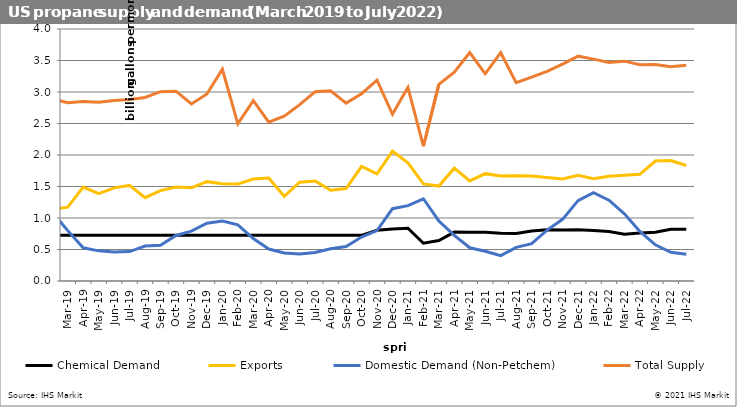
| Category | Chemical Demand | Exports | Domestic Demand (Non-Petchem)  | Total Supply  |
|---|---|---|---|---|
| 2016-01-15 | 0.757 | 1.106 | 1.058 | 2.367 |
| 2016-02-15 | 0.76 | 1.129 | 0.991 | 2.439 |
| 2016-03-15 | 0.698 | 0.859 | 0.746 | 2.413 |
| 2016-04-15 | 0.679 | 0.894 | 0.565 | 2.392 |
| 2016-05-15 | 0.643 | 1.141 | 0.5 | 2.404 |
| 2016-06-15 | 0.661 | 0.948 | 0.493 | 2.36 |
| 2016-07-15 | 0.747 | 0.964 | 0.504 | 2.379 |
| 2016-08-15 | 0.874 | 0.863 | 0.561 | 2.388 |
| 2016-09-15 | 0.827 | 0.76 | 0.615 | 2.381 |
| 2016-10-15 | 0.786 | 1.1 | 0.762 | 2.373 |
| 2016-11-15 | 0.774 | 1.084 | 0.848 | 2.466 |
| 2016-12-15 | 0.819 | 1.345 | 0.995 | 2.417 |
| 2017-01-15 | 0.819 | 1.331 | 1.06 | 2.478 |
| 2017-02-15 | 0.775 | 1.146 | 0.987 | 2.431 |
| 2017-03-15 | 0.87 | 1.289 | 0.752 | 2.484 |
| 2017-04-15 | 0.839 | 1.14 | 0.587 | 2.444 |
| 2017-05-15 | 0.807 | 1.092 | 0.504 | 2.502 |
| 2017-06-15 | 0.799 | 0.965 | 0.489 | 2.492 |
| 2017-07-15 | 0.804 | 1.015 | 0.486 | 2.497 |
| 2017-08-15 | 0.781 | 0.914 | 0.54 | 2.469 |
| 2017-09-15 | 0.705 | 1.179 | 0.603 | 2.412 |
| 2017-10-15 | 0.72 | 1.333 | 0.789 | 2.61 |
| 2017-11-15 | 0.751 | 1.196 | 0.871 | 2.632 |
| 2017-12-15 | 0.758 | 1.279 | 0.975 | 2.659 |
| 2018-01-15 | 0.759 | 1.085 | 1.198 | 2.727 |
| 2018-02-15 | 0.769 | 1.045 | 0.986 | 2.719 |
| 2018-03-15 | 0.782 | 1.135 | 0.772 | 2.69 |
| 2018-04-15 | 0.764 | 1.119 | 0.677 | 2.685 |
| 2018-05-15 | 0.708 | 1.28 | 0.512 | 2.68 |
| 2018-06-15 | 0.743 | 1.12 | 0.573 | 2.705 |
| 2018-07-15 | 0.759 | 1.372 | 0.506 | 2.756 |
| 2018-08-15 | 0.757 | 1.319 | 0.574 | 2.82 |
| 2018-09-15 | 0.748 | 1.051 | 0.629 | 2.846 |
| 2018-10-15 | 0.74 | 1.185 | 0.828 | 2.868 |
| 2018-11-15 | 0.74 | 1.326 | 0.913 | 2.962 |
| 2018-12-15 | 0.74 | 1.485 | 1.013 | 2.993 |
| 2019-01-15 | 0.727 | 1.315 | 1.127 | 2.966 |
| 2019-02-15 | 0.727 | 1.139 | 1.095 | 2.888 |
| 2019-03-15 | 0.727 | 1.173 | 0.799 | 2.83 |
| 2019-04-15 | 0.727 | 1.489 | 0.527 | 2.85 |
| 2019-05-15 | 0.727 | 1.386 | 0.479 | 2.837 |
| 2019-06-15 | 0.727 | 1.478 | 0.46 | 2.866 |
| 2019-07-15 | 0.727 | 1.517 | 0.467 | 2.881 |
| 2019-08-15 | 0.727 | 1.322 | 0.555 | 2.913 |
| 2019-09-15 | 0.727 | 1.435 | 0.566 | 3.006 |
| 2019-10-15 | 0.727 | 1.492 | 0.723 | 3.014 |
| 2019-11-15 | 0.727 | 1.48 | 0.792 | 2.811 |
| 2019-12-15 | 0.727 | 1.577 | 0.918 | 2.969 |
| 2020-01-15 | 0.725 | 1.545 | 0.952 | 3.361 |
| 2020-02-15 | 0.725 | 1.538 | 0.892 | 2.495 |
| 2020-03-15 | 0.725 | 1.618 | 0.674 | 2.863 |
| 2020-04-15 | 0.725 | 1.633 | 0.508 | 2.52 |
| 2020-05-15 | 0.725 | 1.345 | 0.443 | 2.618 |
| 2020-06-15 | 0.725 | 1.569 | 0.428 | 2.8 |
| 2020-07-15 | 0.725 | 1.587 | 0.453 | 3.004 |
| 2020-08-15 | 0.725 | 1.441 | 0.511 | 3.018 |
| 2020-09-15 | 0.725 | 1.468 | 0.547 | 2.824 |
| 2020-10-15 | 0.725 | 1.817 | 0.698 | 2.974 |
| 2020-11-15 | 0.807 | 1.699 | 0.8 | 3.188 |
| 2020-12-15 | 0.825 | 2.061 | 1.147 | 2.647 |
| 2021-01-15 | 0.838 | 1.875 | 1.197 | 3.075 |
| 2021-02-15 | 0.599 | 1.54 | 1.305 | 2.139 |
| 2021-03-15 | 0.643 | 1.507 | 0.953 | 3.122 |
| 2021-04-15 | 0.776 | 1.791 | 0.724 | 3.313 |
| 2021-05-15 | 0.774 | 1.589 | 0.528 | 3.626 |
| 2021-06-15 | 0.775 | 1.704 | 0.472 | 3.289 |
| 2021-07-15 | 0.758 | 1.668 | 0.403 | 3.624 |
| 2021-08-15 | 0.753 | 1.672 | 0.533 | 3.147 |
| 2021-09-15 | 0.794 | 1.665 | 0.591 | 3.236 |
| 2021-10-15 | 0.813 | 1.644 | 0.808 | 3.326 |
| 2021-11-15 | 0.811 | 1.619 | 0.979 | 3.442 |
| 2021-12-15 | 0.814 | 1.678 | 1.276 | 3.569 |
| 2022-01-15 | 0.803 | 1.622 | 1.401 | 3.522 |
| 2022-02-15 | 0.785 | 1.663 | 1.282 | 3.47 |
| 2022-03-15 | 0.743 | 1.678 | 1.066 | 3.489 |
| 2022-04-15 | 0.761 | 1.694 | 0.786 | 3.432 |
| 2022-05-15 | 0.773 | 1.904 | 0.575 | 3.435 |
| 2022-06-15 | 0.822 | 1.913 | 0.456 | 3.4 |
| 2022-07-15 | 0.823 | 1.833 | 0.425 | 3.425 |